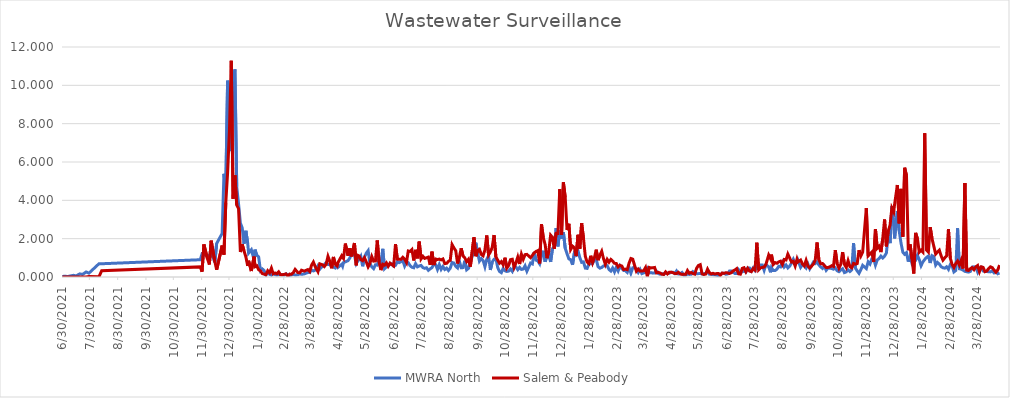
| Category | MWRA North | Salem & Peabody |
|---|---|---|
| 6/30/21 | 0.023 | 0 |
| 7/2/21 | 0.04 | 0 |
| 7/6/21 | 0.027 | 0 |
| 7/8/21 | 0.05 | 0 |
| 7/12/21 | 0.087 | 0 |
| 7/15/21 | 0.059 | 0 |
| 7/19/21 | 0.163 | 0 |
| 7/22/21 | 0.136 | 0 |
| 7/26/21 | 0.263 | 0 |
| 7/29/21 | 0.2 | 0.032 |
| 8/9/21 | 0.691 | 0.007 |
| 8/12/21 | 0.691 | 0.329 |
| 11/28/21 | 0.901 | 0.528 |
| 11/30/21 | 1.204 | 0.275 |
| 12/2/21 | 1.163 | 1.699 |
| 12/6/21 | 1.093 | 0.943 |
| 12/8/21 | 1.152 | 0.651 |
| 12/10/21 | 1.257 | 1.895 |
| 12/14/21 | 0.765 | 0.806 |
| 12/16/21 | 1.751 | 0.377 |
| 12/22/21 | 2.277 | 1.638 |
| 12/24/21 | 5.383 | 1.167 |
| 12/26/21 | 4.572 | 3.882 |
| 12/28/21 | 10.243 | 5.443 |
| 12/30/21 | 8.435 | 7.638 |
| 1/1/22 | 6.568 | 11.282 |
| 1/3/22 | 10.196 | 4.086 |
| 1/5/22 | 10.833 | 5.297 |
| 1/7/22 | 4.705 | 3.753 |
| 1/9/22 | 3.807 | 3.57 |
| 1/11/22 | 2.813 | 1.302 |
| 1/13/22 | 2.562 | 1.704 |
| 1/15/22 | 1.737 | 1.36 |
| 1/17/22 | 2.411 | 1.052 |
| 1/19/22 | 1.766 | 0.581 |
| 1/20/22 | 1.245 | 0.849 |
| 1/23/22 | 1.42 | 0.312 |
| 1/26/22 | 0.904 | 1.062 |
| 1/27/22 | 1.426 | 0.538 |
| 1/29/22 | 1.132 | 0.587 |
| 1/31/22 | 1.053 | 0.378 |
| 2/2/22 | 0.334 | 0.319 |
| 2/4/22 | 0.422 | 0.179 |
| 2/6/22 | 0.336 | 0.151 |
| 2/8/22 | 0.11 | 0.116 |
| 2/10/22 | 0.233 | 0.327 |
| 2/12/22 | 0.14 | 0.223 |
| 2/14/22 | 0.094 | 0.461 |
| 2/16/22 | 0.206 | 0.164 |
| 2/18/22 | 0.124 | 0.209 |
| 2/20/22 | 0.101 | 0.169 |
| 2/22/22 | 0.124 | 0.267 |
| 2/24/22 | 0.138 | 0.116 |
| 2/26/22 | 0.113 | 0.121 |
| 2/28/22 | 0.102 | 0.138 |
| 3/2/22 | 0.17 | 0.16 |
| 3/4/22 | 0.121 | 0.039 |
| 3/6/22 | 0.08 | 0.151 |
| 3/8/22 | 0.105 | 0.146 |
| 3/10/22 | 0.139 | 0.227 |
| 3/12/22 | 0.105 | 0.397 |
| 3/15/22 | 0.115 | 0.231 |
| 3/17/22 | 0.165 | 0.219 |
| 3/19/22 | 0.138 | 0.356 |
| 3/22/22 | 0.161 | 0.308 |
| 3/26/22 | 0.236 | 0.388 |
| 3/28/22 | 0.23 | 0.293 |
| 3/30/22 | 0.371 | 0.617 |
| 4/1/22 | 0.316 | 0.779 |
| 4/3/22 | 0.358 | 0.54 |
| 4/6/22 | 0.589 | 0.279 |
| 4/8/22 | 0.411 | 0.688 |
| 4/11/22 | 0.565 | 0.635 |
| 4/13/22 | 0.647 | 0.546 |
| 4/15/22 | 0.752 | 0.666 |
| 4/17/22 | 0.654 | 1.077 |
| 4/19/22 | 0.641 | 0.82 |
| 4/21/22 | 0.571 | 0.454 |
| 4/23/22 | 0.524 | 1.046 |
| 4/25/22 | 0.471 | 0.662 |
| 4/27/22 | 0.623 | 0.575 |
| 4/28/22 | 0.505 | 0.756 |
| 5/2/22 | 0.662 | 1.104 |
| 5/3/22 | 0.561 | 1.022 |
| 5/4/22 | 0.751 | 0.963 |
| 5/6/22 | 0.789 | 1.744 |
| 5/9/22 | 0.853 | 1.115 |
| 5/11/22 | 0.995 | 1.498 |
| 5/13/22 | 1.285 | 1.074 |
| 5/16/22 | 1.143 | 1.773 |
| 5/18/22 | 0.696 | 0.611 |
| 5/19/22 | 0.784 | 1.144 |
| 5/21/22 | 0.906 | 1.1 |
| 5/23/22 | 1.077 | 0.91 |
| 5/25/22 | 0.561 | 0.853 |
| 5/27/22 | 1.043 | 1.006 |
| 5/29/22 | 1.246 | 0.785 |
| 5/31/22 | 1.375 | 0.53 |
| 6/2/22 | 0.696 | 0.713 |
| 6/4/22 | 0.532 | 1.066 |
| 6/6/22 | 0.435 | 0.828 |
| 6/8/22 | 0.636 | 0.839 |
| 6/10/22 | 0.619 | 1.907 |
| 6/12/22 | 0.932 | 0.783 |
| 6/14/22 | 0.461 | 0.361 |
| 6/16/22 | 1.468 | 0.667 |
| 6/18/22 | 0.433 | 0.622 |
| 6/20/22 | 0.532 | 0.737 |
| 6/22/22 | 0.611 | 0.559 |
| 6/24/22 | 0.648 | 0.724 |
| 6/26/22 | 0.688 | 0.646 |
| 6/28/22 | 0.562 | 0.577 |
| 6/30/22 | 0.607 | 1.712 |
| 7/2/22 | 0.8 | 0.932 |
| 7/4/22 | 0.751 | 0.927 |
| 7/6/22 | 0.8 | 0.928 |
| 7/8/22 | 0.861 | 1.027 |
| 7/10/22 | 0.579 | 0.928 |
| 7/12/22 | 0.808 | 0.757 |
| 7/14/22 | 0.742 | 1.358 |
| 7/16/22 | 0.592 | 1.335 |
| 7/18/22 | 0.509 | 1.432 |
| 7/20/22 | 0.482 | 0.863 |
| 7/22/22 | 0.695 | 1.416 |
| 7/24/22 | 0.53 | 0.974 |
| 7/26/22 | 0.576 | 1.848 |
| 7/28/22 | 0.605 | 0.943 |
| 7/30/22 | 0.492 | 1.081 |
| 8/1/22 | 0.453 | 0.969 |
| 8/3/22 | 0.481 | 1.003 |
| 8/5/22 | 0.349 | 1.038 |
| 8/7/22 | 0.424 | 0.634 |
| 8/9/22 | 0.492 | 1.322 |
| 8/11/22 | 0.664 | 0.624 |
| 8/13/22 | 0.648 | 0.94 |
| 8/15/22 | 0.393 | 0.912 |
| 8/17/22 | 0.648 | 0.935 |
| 8/19/22 | 0.397 | 0.892 |
| 8/21/22 | 0.546 | 0.94 |
| 8/23/22 | 0.392 | 0.701 |
| 8/25/22 | 0.461 | 0.713 |
| 8/27/22 | 0.339 | 0.812 |
| 8/29/22 | 0.46 | 0.873 |
| 8/31/22 | 0.758 | 1.69 |
| 9/2/22 | 0.728 | 1.519 |
| 9/4/22 | 0.557 | 1.377 |
| 9/6/22 | 0.473 | 0.706 |
| 9/8/22 | 0.826 | 1.041 |
| 9/10/22 | 0.485 | 1.497 |
| 9/12/22 | 0.489 | 1.095 |
| 9/14/22 | 0.851 | 0.994 |
| 9/16/22 | 0.375 | 0.804 |
| 9/18/22 | 0.45 | 0.926 |
| 9/20/22 | 0.767 | 0.537 |
| 9/24/22 | 1.357 | 2.067 |
| 9/26/22 | 1.79 | 1.083 |
| 9/28/22 | 1.272 | 1.382 |
| 9/30/22 | 0.825 | 1.447 |
| 10/2/22 | 0.959 | 1.18 |
| 10/4/22 | 0.862 | 1.109 |
| 10/6/22 | 0.536 | 1.407 |
| 10/8/22 | 0.925 | 2.166 |
| 10/10/22 | 1.104 | 1.147 |
| 10/12/22 | 0.369 | 1.304 |
| 10/14/22 | 0.781 | 1.544 |
| 10/16/22 | 0.928 | 2.189 |
| 10/18/22 | 0.972 | 1.054 |
| 10/20/22 | 0.493 | 0.883 |
| 10/22/22 | 0.287 | 0.721 |
| 10/24/22 | 0.224 | 0.803 |
| 10/26/22 | 0.45 | 0.639 |
| 10/28/22 | 0.325 | 1.007 |
| 10/30/22 | 0.287 | 0.464 |
| 11/1/22 | 0.307 | 0.6 |
| 11/3/22 | 0.421 | 0.904 |
| 11/5/22 | 0.293 | 0.926 |
| 11/7/22 | 0.54 | 0.505 |
| 11/9/22 | 0.525 | 0.742 |
| 11/11/22 | 0.38 | 1.039 |
| 11/13/22 | 0.5 | 0.678 |
| 11/15/22 | 0.397 | 1.19 |
| 11/17/22 | 0.414 | 0.927 |
| 11/19/22 | 0.583 | 1.166 |
| 11/21/22 | 0.304 | 1.181 |
| 11/25/22 | 0.727 | 1.009 |
| 11/27/22 | 0.682 | 1.128 |
| 11/29/22 | 1.292 | 1.263 |
| 12/1/22 | 0.879 | 1.332 |
| 12/3/22 | 0.834 | 1.378 |
| 12/5/22 | 0.685 | 0.71 |
| 12/7/22 | 1.094 | 2.747 |
| 12/9/22 | 1.37 | 2.05 |
| 12/11/22 | 0.792 | 1.692 |
| 12/13/22 | 1.108 | 0.983 |
| 12/15/22 | 1.123 | 1.348 |
| 12/17/22 | 0.789 | 2.185 |
| 12/19/22 | 1.476 | 2.073 |
| 12/21/22 | 1.593 | 1.47 |
| 12/23/22 | 2.551 | 2.278 |
| 12/25/22 | 1.597 | 2.275 |
| 12/27/22 | 2.423 | 4.578 |
| 12/29/22 | 2.003 | 2.196 |
| 12/31/22 | 2.33 | 4.939 |
| 1/2/23 | 1.499 | 4.153 |
| 1/4/23 | 1.214 | 2.457 |
| 1/6/23 | 0.947 | 2.778 |
| 1/8/23 | 0.904 | 1.437 |
| 1/10/23 | 0.64 | 1.61 |
| 1/12/23 | 1.241 | 1.532 |
| 1/14/23 | 1.154 | 1.092 |
| 1/16/23 | 1.37 | 2.202 |
| 1/18/23 | 1.009 | 1.465 |
| 1/20/23 | 0.763 | 2.809 |
| 1/22/23 | 0.787 | 2.022 |
| 1/24/23 | 0.465 | 1.08 |
| 1/26/23 | 0.448 | 0.782 |
| 1/28/23 | 0.685 | 0.698 |
| 1/30/23 | 0.689 | 1.11 |
| 2/1/23 | 0.706 | 0.743 |
| 2/3/23 | 0.907 | 1.008 |
| 2/5/23 | 0.913 | 1.425 |
| 2/7/23 | 0.539 | 0.879 |
| 2/9/23 | 0.461 | 1.141 |
| 2/11/23 | 0.498 | 1.339 |
| 2/13/23 | 0.579 | 0.95 |
| 2/15/23 | 0.588 | 0.66 |
| 2/17/23 | 0.592 | 0.919 |
| 2/19/23 | 0.391 | 0.773 |
| 2/21/23 | 0.312 | 0.917 |
| 2/23/23 | 0.472 | 0.828 |
| 2/25/23 | 0.266 | 0.714 |
| 2/27/23 | 0.513 | 0.704 |
| 3/1/23 | 0.321 | 0.528 |
| 3/3/23 | 0.58 | 0.61 |
| 3/5/23 | 0.437 | 0.573 |
| 3/7/23 | 0.341 | 0.388 |
| 3/9/23 | 0.33 | 0.412 |
| 3/11/23 | 0.24 | 0.383 |
| 3/13/23 | 0.499 | 0.725 |
| 3/15/23 | 0.197 | 0.964 |
| 3/17/23 | 0.479 | 0.931 |
| 3/19/23 | 0.51 | 0.612 |
| 3/21/23 | 0.399 | 0.301 |
| 3/23/23 | 0.237 | 0.415 |
| 3/25/23 | 0.395 | 0.308 |
| 3/27/23 | 0.178 | 0.314 |
| 3/29/23 | 0.217 | 0.326 |
| 3/31/23 | 0.243 | 0.491 |
| 4/2/23 | 0.43 | 0.024 |
| 4/4/23 | 0.215 | 0.5 |
| 4/6/23 | 0.229 | 0.475 |
| 4/8/23 | 0.202 | 0.481 |
| 4/10/23 | 0.209 | 0.497 |
| 4/12/23 | 0.305 | 0.215 |
| 4/14/23 | 0.182 | 0.243 |
| 4/16/23 | 0.142 | 0.21 |
| 4/18/23 | 0.177 | 0.143 |
| 4/20/23 | 0.158 | 0.13 |
| 4/22/23 | 0.195 | 0.266 |
| 4/24/23 | 0.209 | 0.158 |
| 4/26/23 | 0.195 | 0.249 |
| 4/28/23 | 0.245 | 0.25 |
| 4/30/23 | 0.245 | 0.228 |
| 5/2/23 | 0.18 | 0.185 |
| 5/4/23 | 0.314 | 0.177 |
| 5/6/23 | 0.157 | 0.247 |
| 5/8/23 | 0.162 | 0.165 |
| 5/10/23 | 0.234 | 0.135 |
| 5/12/23 | 0.1 | 0.143 |
| 5/14/23 | 0.1 | 0.144 |
| 5/16/23 | 0.156 | 0.338 |
| 5/18/23 | 0.134 | 0.195 |
| 5/20/23 | 0.141 | 0.237 |
| 5/22/23 | 0.279 | 0.178 |
| 5/24/23 | 0.223 | 0.15 |
| 5/26/23 | 0.176 | 0.458 |
| 5/28/23 | 0.176 | 0.602 |
| 5/30/23 | 0.183 | 0.643 |
| 6/1/23 | 0.153 | 0.167 |
| 6/3/23 | 0.172 | 0.13 |
| 6/5/23 | 0.198 | 0.156 |
| 6/7/23 | 0.243 | 0.409 |
| 6/9/23 | 0.143 | 0.231 |
| 6/11/23 | 0.143 | 0.16 |
| 6/13/23 | 0.122 | 0.195 |
| 6/15/23 | 0.11 | 0.156 |
| 6/17/23 | 0.095 | 0.181 |
| 6/19/23 | 0.054 | 0.18 |
| 6/21/23 | 0.122 | 0.089 |
| 6/23/23 | 0.195 | 0.208 |
| 6/25/23 | 0.195 | 0.187 |
| 6/27/23 | 0.141 | 0.225 |
| 6/29/23 | 0.16 | 0.211 |
| 7/1/23 | 0.31 | 0.183 |
| 7/3/23 | 0.312 | 0.225 |
| 7/5/23 | 0.244 | 0.321 |
| 7/7/23 | 0.184 | 0.366 |
| 7/9/23 | 0.184 | 0.437 |
| 7/11/23 | 0.38 | 0.163 |
| 7/13/23 | 0.255 | 0.147 |
| 7/15/23 | 0.268 | 0.451 |
| 7/17/23 | 0.315 | 0.484 |
| 7/19/23 | 0.252 | 0.278 |
| 7/21/23 | 0.47 | 0.451 |
| 7/23/23 | 0.47 | 0.309 |
| 7/25/23 | 0.325 | 0.277 |
| 7/27/23 | 0.478 | 0.439 |
| 7/29/23 | 0.339 | 0.359 |
| 7/31/23 | 0.538 | 1.791 |
| 8/2/23 | 0.514 | 0.375 |
| 8/4/23 | 0.625 | 0.476 |
| 8/6/23 | 0.625 | 0.501 |
| 8/8/23 | 0.347 | 0.517 |
| 8/10/23 | 0.645 | 0.663 |
| 8/13/23 | 0.533 | 1.145 |
| 8/15/23 | 0.245 | 0.951 |
| 8/16/23 | 0.489 | 1.169 |
| 8/18/23 | 0.336 | 0.656 |
| 8/20/23 | 0.336 | 0.753 |
| 8/22/23 | 0.407 | 0.717 |
| 8/24/23 | 0.558 | 0.79 |
| 8/26/23 | 0.526 | 0.826 |
| 8/28/23 | 0.757 | 0.651 |
| 8/30/23 | 0.52 | 0.914 |
| 9/1/23 | 0.628 | 0.889 |
| 9/3/23 | 0.475 | 1.194 |
| 9/5/23 | 0.563 | 0.989 |
| 9/7/23 | 0.731 | 0.782 |
| 9/9/23 | 0.922 | 0.819 |
| 9/11/23 | 0.696 | 0.573 |
| 9/13/23 | 0.75 | 0.928 |
| 9/14/23 | 0.882 | 0.78 |
| 9/17/23 | 0.503 | 0.884 |
| 9/19/23 | 0.645 | 0.68 |
| 9/21/23 | 0.575 | 0.58 |
| 9/23/23 | 0.465 | 0.87 |
| 9/25/23 | 0.673 | 0.57 |
| 9/27/23 | 0.429 | 0.47 |
| 10/1/23 | 0.773 | 0.67 |
| 10/3/23 | 0.702 | 0.88 |
| 10/5/23 | 0.78 | 1.8 |
| 10/7/23 | 0.63 | 0.9 |
| 10/9/23 | 0.524 | 0.69 |
| 10/11/23 | 0.448 | 0.7 |
| 10/13/23 | 0.571 | 0.6 |
| 10/15/23 | 0.35 | 0.5 |
| 10/17/23 | 0.468 | 0.5 |
| 10/19/23 | 0.46 | 0.53 |
| 10/21/23 | 0.442 | 0.59 |
| 10/23/23 | 0.407 | 0.55 |
| 10/25/23 | 0.475 | 1.4 |
| 10/27/23 | 0.329 | 0.7 |
| 10/29/23 | 0.277 | 0.46 |
| 10/31/23 | 0.366 | 0.66 |
| 11/2/23 | 0.431 | 1.3 |
| 11/4/23 | 0.23 | 0.66 |
| 11/6/23 | 0.268 | 0.5 |
| 11/8/23 | 0.372 | 0.85 |
| 11/10/23 | 0.287 | 0.54 |
| 11/12/23 | 0.373 | 0.48 |
| 11/14/23 | 1.767 | 0.71 |
| 11/16/23 | 0.468 | 0.67 |
| 11/18/23 | 0.315 | 0.7 |
| 11/20/23 | 0.188 | 1.4 |
| 11/22/23 | 0.38 | 1.1 |
| 11/24/23 | 0.608 | 1.3 |
| 11/28/23 | 0.44 | 3.6 |
| 11/30/23 | 0.791 | 1.1 |
| 12/2/23 | 0.677 | 1.2 |
| 12/4/23 | 0.943 | 1.3 |
| 12/6/23 | 0.966 | 0.79 |
| 12/8/23 | 0.618 | 2.5 |
| 12/10/23 | 0.892 | 1.5 |
| 12/12/23 | 0.964 | 1.6 |
| 12/14/23 | 1.091 | 1.3 |
| 12/16/23 | 0.99 | 2 |
| 12/18/23 | 1.089 | 3 |
| 12/20/23 | 1.252 | 1.6 |
| 12/22/23 | 2.214 | 2.4 |
| 12/24/23 | 1.769 | 2.7 |
| 12/26/23 | 3.689 | 3.6 |
| 12/28/23 | 2.81 | 3.4 |
| 12/29/23 | 2.013 | 3.8 |
| 1/1/24 | 3.443 | 4.8 |
| 1/3/24 | 2.411 | 2.8 |
| 1/5/24 | 1.78 | 4.6 |
| 1/7/24 | 1.295 | 2.1 |
| 1/9/24 | 1.184 | 5.7 |
| 1/11/24 | 1.27 | 5.3 |
| 1/13/24 | 0.802 | 1.4 |
| 1/15/24 | 1.091 | 1.7 |
| 1/17/24 | 0.716 | 0.94 |
| 1/19/24 | 0.852 | 0.18 |
| 1/21/24 | 0.866 | 2.3 |
| 1/23/24 | 1.127 | 2 |
| 1/25/24 | 0.911 | 1.3 |
| 1/27/24 | 0.591 | 1.4 |
| 1/29/24 | 0.786 | 1.3 |
| 1/31/24 | 0.915 | 7.5 |
| 2/2/24 | 1.022 | 1.4 |
| 2/4/24 | 1.092 | 1.3 |
| 2/6/24 | 0.732 | 2.6 |
| 2/8/24 | 1.114 | 2 |
| 2/10/24 | 1.061 | 1.6 |
| 2/12/24 | 0.622 | 1.2 |
| 2/14/24 | 0.758 | 1.3 |
| 2/16/24 | 0.672 | 1.4 |
| 2/18/24 | 0.536 | 1.1 |
| 2/20/24 | 0.483 | 0.88 |
| 2/22/24 | 0.462 | 1 |
| 2/24/24 | 0.532 | 1.1 |
| 2/26/24 | 0.398 | 2.5 |
| 2/28/24 | 0.647 | 0.99 |
| 3/1/24 | 0.579 | 0.66 |
| 3/3/24 | 0.265 | 0.5 |
| 3/5/24 | 0.341 | 0.7 |
| 3/7/24 | 2.546 | 0.83 |
| 3/9/24 | 0.429 | 0.62 |
| 3/11/24 | 0.407 | 0.87 |
| 3/13/24 | 0.358 | 0.44 |
| 3/15/24 | 0.293 | 4.9 |
| 3/17/24 | 0.275 | 0.36 |
| 3/19/24 | 0.256 | 0.34 |
| 3/21/24 | 0.289 | 0.43 |
| 3/23/24 | 0.517 | 0.49 |
| 3/25/24 | 0.532 | 0.38 |
| 3/27/24 | 0.511 | 0.53 |
| 3/29/24 | 0.256 | 0.6 |
| 3/31/24 | 0.474 | 0.28 |
| 4/2/24 | 0.507 | 0.53 |
| 4/4/24 | 0.315 | 0.5 |
| 4/6/24 | 0.284 | 0.28 |
| 4/8/24 | 0.287 | 0.31 |
| 4/10/24 | 0.272 | 0.44 |
| 4/12/24 | 0.267 | 0.53 |
| 4/14/24 | 0.327 | 0.49 |
| 4/16/24 | 0.217 | 0.36 |
| 4/18/24 | 0.3 | 0.25 |
| 4/20/24 | 0.171 | 0.36 |
| 4/22/24 | 0.212 | 0.62 |